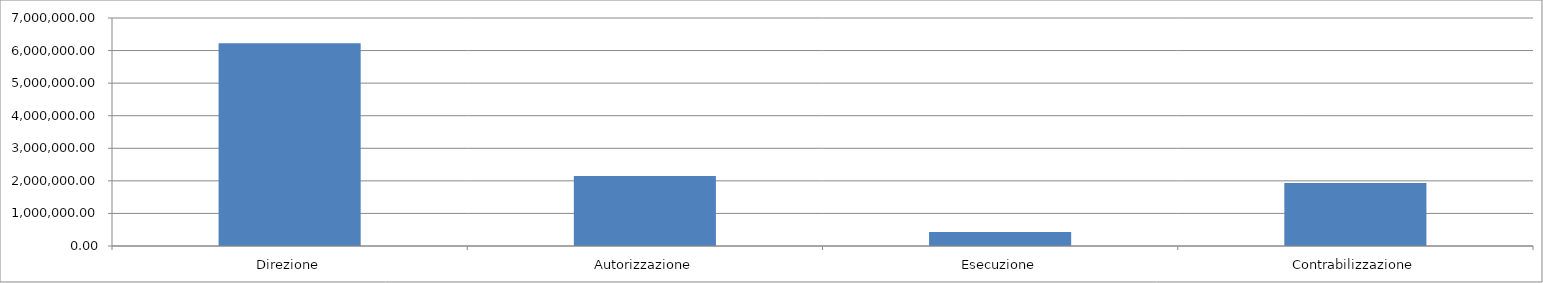
| Category | Series 0 |
|---|---|
| Direzione | 6228107.698 |
| Autorizzazione | 2147623.344 |
| Esecuzione | 429524.669 |
| Contrabilizzazione | 1932861.01 |